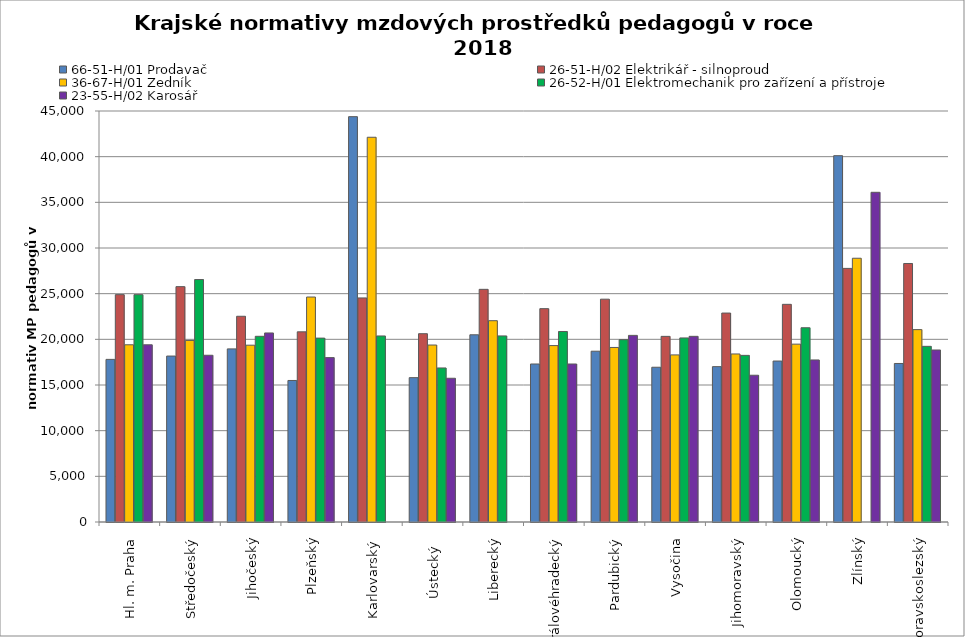
| Category | 66-51-H/01 Prodavač | 26-51-H/02 Elektrikář - silnoproud | 36-67-H/01 Zedník | 26-52-H/01 Elektromechanik pro zařízení a přístroje | 23-55-H/02 Karosář |
|---|---|---|---|---|---|
| Hl. m. Praha | 17805.176 | 24892.105 | 19403.077 | 24892.105 | 19403.077 |
| Středočeský | 18169.038 | 25770.201 | 19880.376 | 26546.83 | 18257.103 |
| Jihočeský | 18954.503 | 22524.005 | 19358.256 | 20330.974 | 20698.401 |
| Plzeňský | 15495.51 | 20820.567 | 24633.147 | 20133.942 | 17997.279 |
| Karlovarský  | 44379.562 | 24532.616 | 42124.711 | 20368.509 | 0 |
| Ústecký   | 15804.539 | 20617.523 | 19376.491 | 16867.029 | 15738.93 |
| Liberecký | 20497.037 | 25473.632 | 22040.375 | 20373.812 | 0 |
| Královéhradecký | 17300.188 | 23359.645 | 19315.215 | 20858.244 | 17300.188 |
| Pardubický | 18699.517 | 24395.798 | 19109.819 | 19964.011 | 20432.375 |
| Vysočina | 16943.914 | 20324.238 | 18296.277 | 20153.898 | 20328.851 |
| Jihomoravský | 17011.008 | 22877.056 | 18397.717 | 18244.975 | 16068.419 |
| Olomoucký | 17624.291 | 23831.387 | 19472.565 | 21269.707 | 17744.022 |
| Zlínský | 40108 | 27767.077 | 28877.76 | 0 | 36097.2 |
| Moravskoslezský | 17356.554 | 28304.195 | 21063.404 | 19234.129 | 18832.573 |